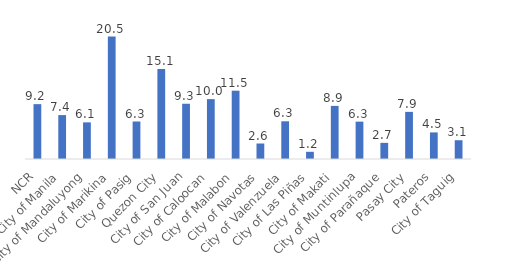
| Category | 2020 |
|---|---|
| NCR | 9.203 |
| City of Manila | 7.366 |
| City of Mandaluyong | 6.148 |
| City of Marikina | 20.536 |
| City of Pasig | 6.292 |
| Quezon City | 15.103 |
| City of San Juan | 9.27 |
| City of Caloocan | 10.046 |
| City of Malabon | 11.46 |
| City of Navotas | 2.6 |
| City of Valenzuela | 6.326 |
| City of Las Piñas | 1.209 |
| City of Makati | 8.91 |
| City of Muntinlupa | 6.27 |
| City of Parañaque | 2.707 |
| Pasay City | 7.909 |
| Pateros | 4.46 |
| City of Taguig | 3.147 |